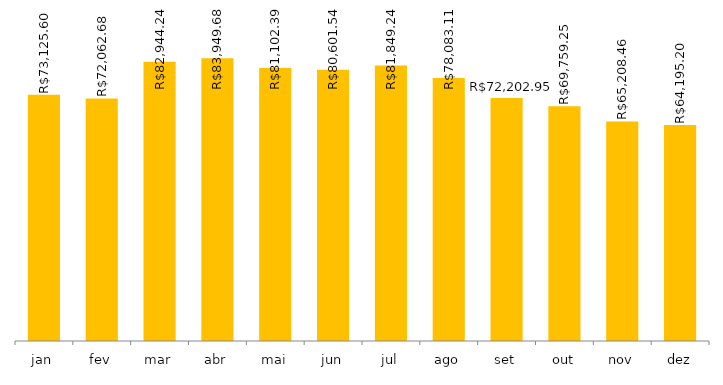
| Category | 2019 |
|---|---|
| jan | 73125.6 |
| fev | 72062.68 |
| mar | 82944.24 |
| abr | 83949.68 |
| mai | 81102.39 |
| jun | 80601.54 |
| jul | 81849.24 |
| ago | 78083.11 |
| set | 72202.95 |
| out | 69759.25 |
| nov | 65208.46 |
| dez | 64195.2 |